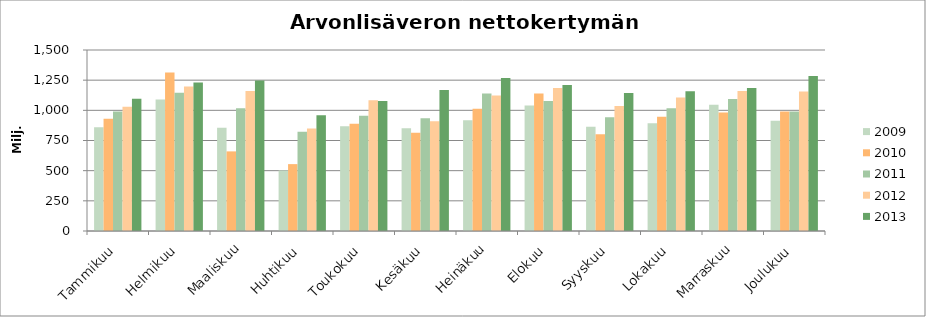
| Category | 2009 | 2010 | 2011 | 2012 | 2013 |
|---|---|---|---|---|---|
| Tammikuu | 858.934 | 929.369 | 989.979 | 1030.641 | 1096.075 |
| Helmikuu | 1089.664 | 1313.151 | 1145.438 | 1198.153 | 1230.33 |
| Maaliskuu | 856.122 | 659.776 | 1016.463 | 1160.067 | 1247.422 |
| Huhtikuu | 501.743 | 554.255 | 821.506 | 848.926 | 959.001 |
| Toukokuu | 867.163 | 889.769 | 955.963 | 1083.741 | 1078.37 |
| Kesäkuu | 851.056 | 814.024 | 933.418 | 909.246 | 1168.206 |
| Heinäkuu | 918.059 | 1013.537 | 1139.789 | 1122.196 | 1267.424 |
| Elokuu | 1040.537 | 1139.703 | 1077.137 | 1184.622 | 1210.636 |
| Syyskuu | 863.546 | 801.068 | 941.737 | 1035.954 | 1142.819 |
| Lokakuu | 892.063 | 947.674 | 1018.067 | 1107.374 | 1157.981 |
| Marraskuu | 1046.386 | 981.431 | 1094.661 | 1159.214 | 1185.544 |
| Joulukuu | 914.348 | 991.049 | 989.325 | 1156.453 | 1284.095 |